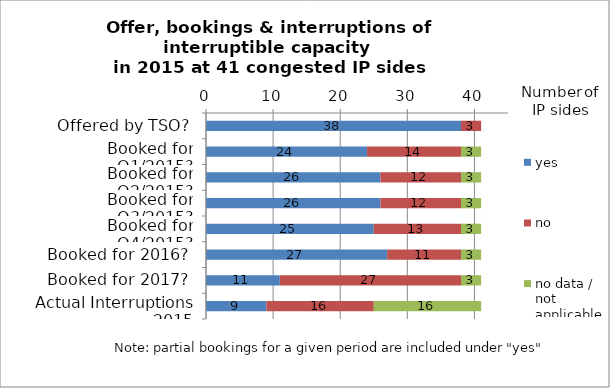
| Category | yes | no | no data / not applicable |
|---|---|---|---|
| Offered by TSO? | 38 | 3 | 0 |
| Booked for Q1/2015? | 24 | 14 | 3 |
| Booked for Q2/2015? | 26 | 12 | 3 |
| Booked for Q3/2015? | 26 | 12 | 3 |
| Booked for Q4/2015? | 25 | 13 | 3 |
| Booked for 2016? | 27 | 11 | 3 |
| Booked for 2017? | 11 | 27 | 3 |
| Actual Interruptions 2015 | 9 | 16 | 16 |